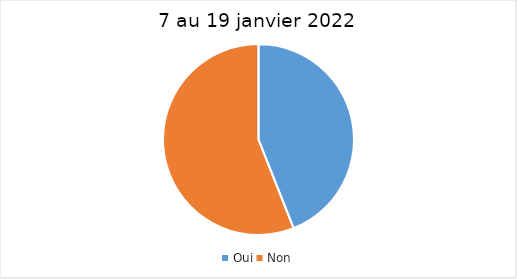
| Category | 7 au 19 janvier 2022 |
|---|---|
| Oui | 44 |
| Non | 56 |